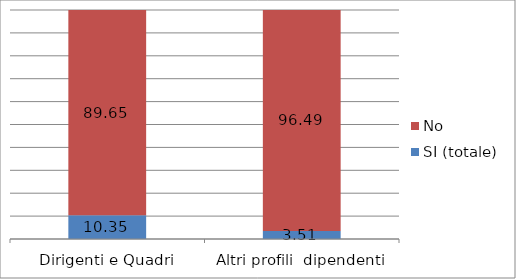
| Category | SI (totale) | No |
|---|---|---|
| Dirigenti e Quadri | 10.346 | 89.654 |
| Altri profili  dipendenti | 3.515 | 96.485 |